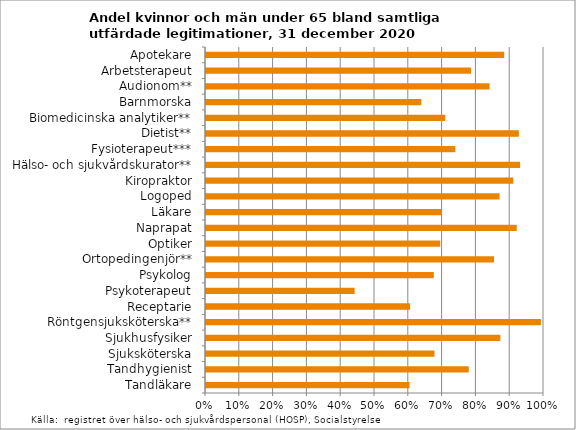
| Category | Andel under 65 |
|---|---|
| Apotekare | 0.882 |
| Arbetsterapeut | 0.784 |
| Audionom** | 0.839 |
| Barnmorska | 0.637 |
| Biomedicinska analytiker** | 0.708 |
| Dietist** | 0.926 |
| Fysioterapeut*** | 0.738 |
| Hälso- och sjukvårdskurator** | 0.929 |
| Kiropraktor | 0.909 |
| Logoped | 0.869 |
| Läkare | 0.697 |
| Naprapat | 0.919 |
| Optiker | 0.693 |
| Ortopedingenjör** | 0.852 |
| Psykolog | 0.674 |
| Psykoterapeut | 0.44 |
| Receptarie | 0.604 |
| Röntgensjuksköterska** | 0.991 |
| Sjukhusfysiker | 0.871 |
| Sjuksköterska | 0.676 |
| Tandhygienist | 0.777 |
| Tandläkare | 0.602 |